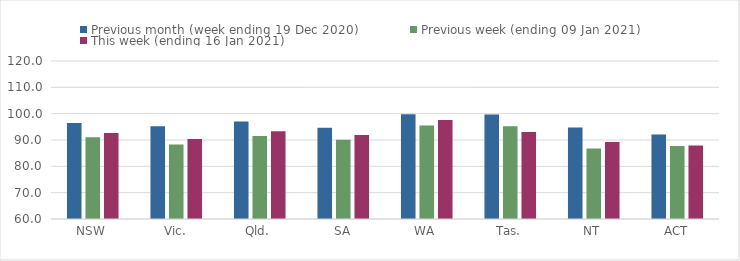
| Category | Previous month (week ending 19 Dec 2020) | Previous week (ending 09 Jan 2021) | This week (ending 16 Jan 2021) |
|---|---|---|---|
| NSW | 96.45 | 91.05 | 92.7 |
| Vic. | 95.25 | 88.27 | 90.37 |
| Qld. | 97.04 | 91.53 | 93.34 |
| SA | 94.68 | 90.06 | 91.91 |
| WA | 99.81 | 95.47 | 97.57 |
| Tas. | 99.73 | 95.24 | 93.05 |
| NT | 94.78 | 86.79 | 89.21 |
| ACT | 92.09 | 87.72 | 87.94 |